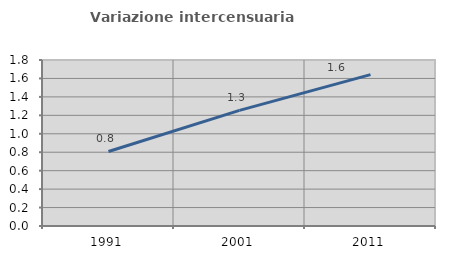
| Category | Variazione intercensuaria annua |
|---|---|
| 1991.0 | 0.808 |
| 2001.0 | 1.254 |
| 2011.0 | 1.641 |